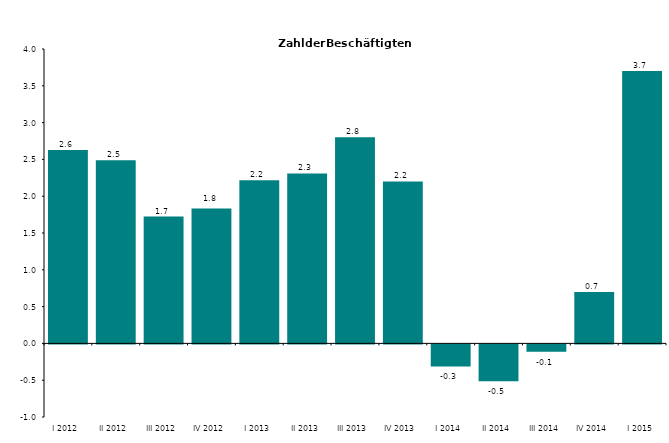
| Category | Series 0 |
|---|---|
| I 2012 | 2.627 |
| II 2012 | 2.487 |
| III 2012 | 1.724 |
| IV 2012 | 1.834 |
| I 2013 | 2.218 |
| II 2013 | 2.309 |
| III 2013 | 2.802 |
| IV 2013 | 2.2 |
| I 2014 | -0.3 |
| II 2014 | -0.5 |
| III 2014 | -0.1 |
| IV 2014 | 0.7 |
| I 2015 | 3.7 |